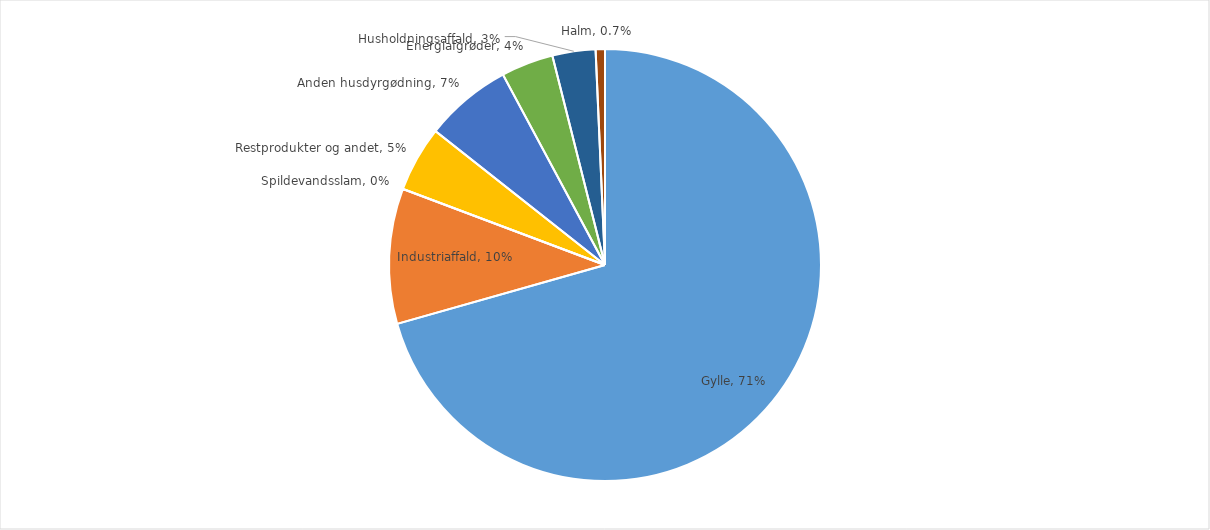
| Category | Series 0 |
|---|---|
| Gylle | 0.706 |
| Industriaffald | 0.101 |
| Spildevandsslam | 0 |
| Restprodukter og andet | 0.049 |
| Anden husdyrgødning | 0.065 |
| Energiafgrøder | 0.039 |
| Husholdningsaffald | 0.032 |
| Halm | 0.007 |